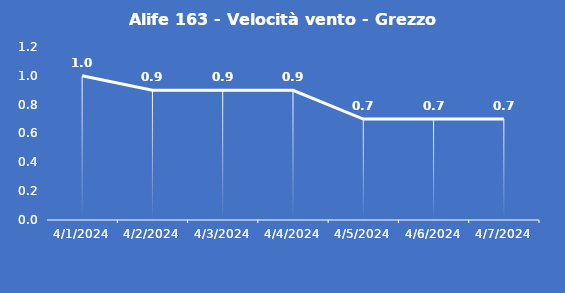
| Category | Alife 163 - Velocità vento - Grezzo (m/s) |
|---|---|
| 4/1/24 | 1 |
| 4/2/24 | 0.9 |
| 4/3/24 | 0.9 |
| 4/4/24 | 0.9 |
| 4/5/24 | 0.7 |
| 4/6/24 | 0.7 |
| 4/7/24 | 0.7 |